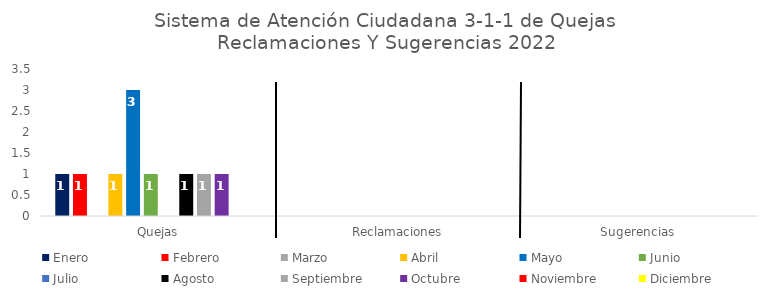
| Category | Enero | Febrero | Marzo | Abril | Mayo | Junio | Julio | Agosto | Septiembre | Octubre | Noviembre | Diciembre |
|---|---|---|---|---|---|---|---|---|---|---|---|---|
| Quejas | 1 | 1 | 0 | 1 | 3 | 1 | 0 | 1 | 1 | 1 | 0 | 0 |
| Reclamaciones | 0 | 0 | 0 | 0 | 0 | 0 | 0 | 0 | 0 | 0 | 0 | 0 |
| Sugerencias | 0 | 0 | 0 | 0 | 0 | 0 | 0 | 0 | 0 | 0 | 0 | 0 |